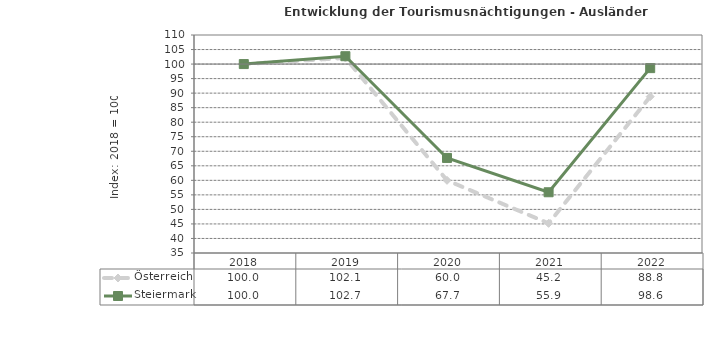
| Category | Österreich | Steiermark |
|---|---|---|
| 2022.0 | 88.8 | 98.6 |
| 2021.0 | 45.2 | 55.9 |
| 2020.0 | 60 | 67.7 |
| 2019.0 | 102.1 | 102.7 |
| 2018.0 | 100 | 100 |